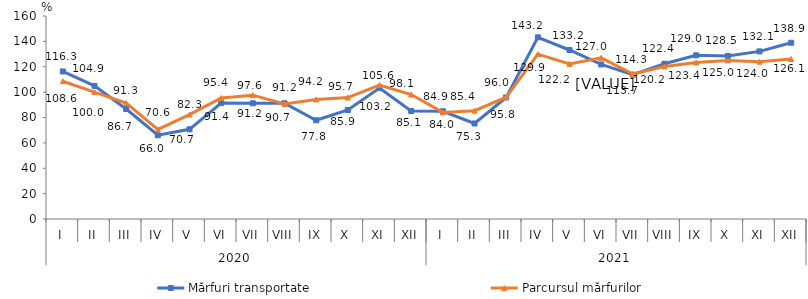
| Category | Mărfuri transportate | Parcursul mărfurilor |
|---|---|---|
| 0 | 116.3 | 108.6 |
| 1 | 104.9 | 100 |
| 2 | 86.7 | 91.3 |
| 3 | 66 | 70.6 |
| 4 | 70.7 | 82.3 |
| 5 | 91.4 | 95.4 |
| 6 | 91.2 | 97.6 |
| 7 | 91.2 | 90.7 |
| 8 | 77.8 | 94.2 |
| 9 | 85.9 | 95.7 |
| 10 | 103.2 | 105.6 |
| 11 | 85.1 | 98.1 |
| 12 | 84.9 | 84 |
| 13 | 75.3 | 85.4 |
| 14 | 95.8 | 96 |
| 15 | 143.2 | 129.9 |
| 16 | 133.2 | 122.2 |
| 17 | 121.8 | 127 |
| 18 | 113.7 | 114.3 |
| 19 | 122.4 | 120.2 |
| 20 | 129 | 123.4 |
| 21 | 128.5 | 125 |
| 22 | 132.1 | 124 |
| 23 | 138.9 | 126.1 |